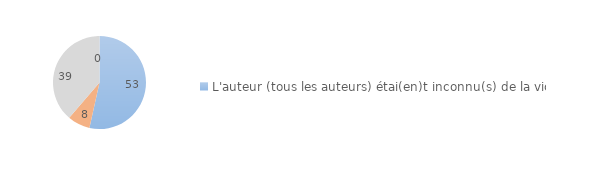
| Category | Series 0 |
|---|---|
| L'auteur (tous les auteurs) étai(en)t inconnu(s) de la victime | 53.486 |
| L'auteur (au moins un auteur) était connu de vue ou personnellement  | 7.806 |
| Ne sait pas/Refus | 38.707 |